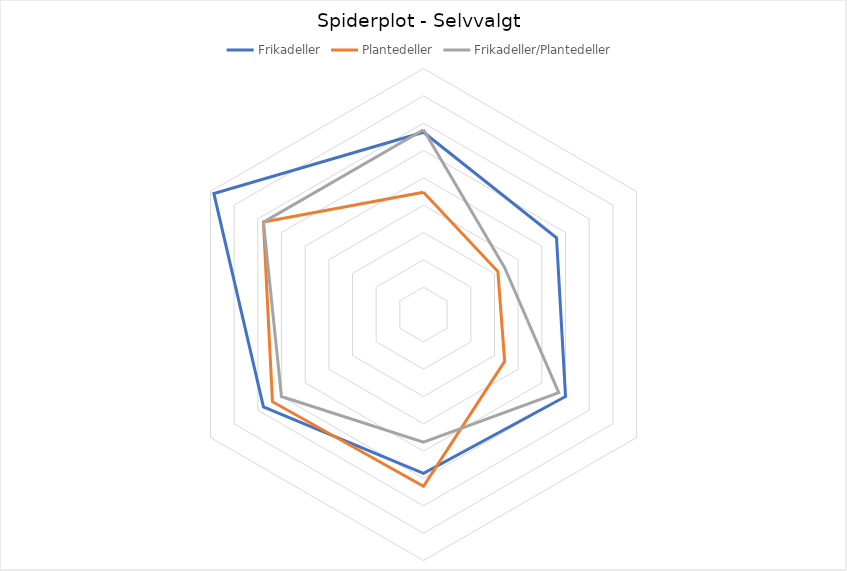
| Category | Frikadeller | Plantedeller | Frikadeller/Plantedeller |
|---|---|---|---|
|  | 3.333 | 2.238 | 3.381 |
|  | 2.81 | 1.571 | 1.714 |
|  | 3 | 1.714 | 2.857 |
|  | 2.905 | 3.143 | 2.333 |
|  | 3.381 | 3.19 | 3 |
|  | 4.429 | 3.381 | 3.381 |